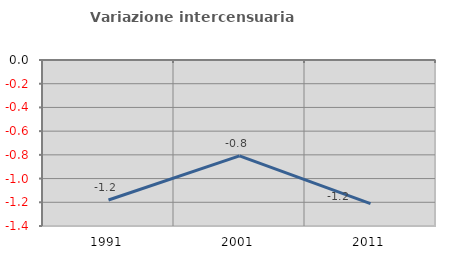
| Category | Variazione intercensuaria annua |
|---|---|
| 1991.0 | -1.181 |
| 2001.0 | -0.808 |
| 2011.0 | -1.211 |